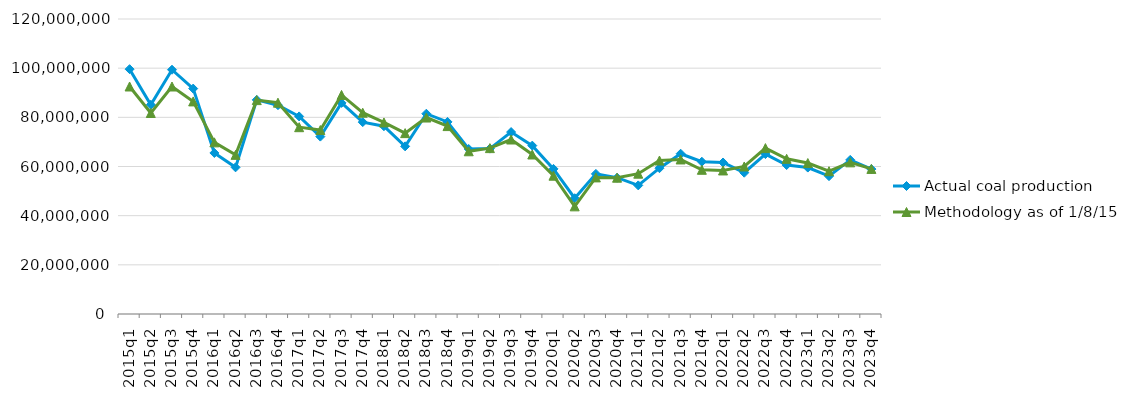
| Category | Actual coal production | Methodology as of 1/8/15 |
|---|---|---|
| 2015q1 | 99592922 | 92545046 |
| 2015q2 | 85117258 | 81768525 |
| 2015q3 | 99365497 | 92538588 |
| 2015q4 | 91696827 | 86474610 |
| 2016q1 | 65507197 | 69813668 |
| 2016q2 | 59662888 | 64738248 |
| 2016q3 | 87105143 | 87003860 |
| 2016q4 | 84942904 | 85952232 |
| 2017q1 | 80374116 | 75986673 |
| 2017q2 | 72161380 | 74831964 |
| 2017q3 | 85866951 | 89114714 |
| 2017q4 | 78051998 | 81873013 |
| 2018q1 | 76384673 | 77921162 |
| 2018q2 | 68187576 | 73572586 |
| 2018q3 | 81469459 | 79917762 |
| 2018q4 | 78145894 | 76437726 |
| 2019q1 | 67126923 | 66192182 |
| 2019q2 | 67282008 | 67480566 |
| 2019q3 | 74007787 | 70980203 |
| 2019q4 | 68495189 | 64886285 |
| 2020q1 | 59033740 | 56258914 |
| 2020q2 | 47089568 | 43791036 |
| 2020q3 | 56994131 | 55566763 |
| 2020q4 | 55438405 | 55438405 |
| 2021q1 | 52321063 | 57077156 |
| 2021q2 | 59311976 | 62426372 |
| 2021q3 | 65196614 | 62866334 |
| 2021q4 | 61942858 | 58664416 |
| 2022q1 | 61628658 | 58388112 |
| 2022q2 | 57472434 | 60011133 |
| 2022q3 | 65042293 | 67483466 |
| 2022q4 | 60587066 | 63115690 |
| 2023q1 | 59564221 | 61407170 |
| 2023q2 | 56071910 | 58093749 |
| 2023q3 | 62684408 | 61689753 |
| 2023q4 | 58940958 | 59010285 |